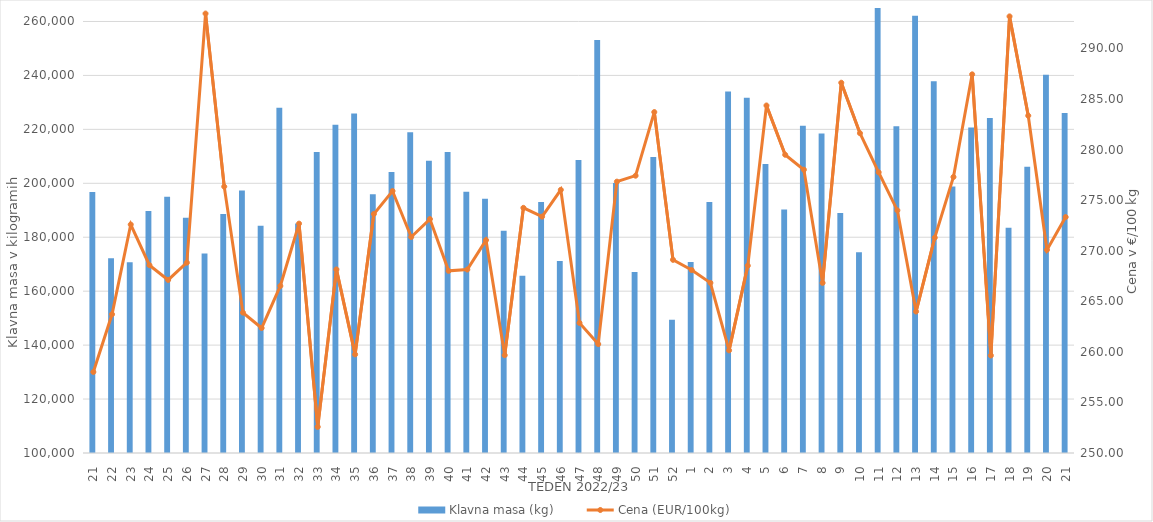
| Category | Klavna masa (kg) |
|---|---|
| 21.0 | 196732 |
| 22.0 | 172190 |
| 23.0 | 170751 |
| 24.0 | 189775 |
| 25.0 | 195029 |
| 26.0 | 187239 |
| 27.0 | 173967 |
| 28.0 | 188601 |
| 29.0 | 197293 |
| 30.0 | 184259 |
| 31.0 | 228023 |
| 32.0 | 185079 |
| 33.0 | 211612 |
| 34.0 | 221748 |
| 35.0 | 225927 |
| 36.0 | 195924 |
| 37.0 | 204224 |
| 38.0 | 218966 |
| 39.0 | 208403 |
| 40.0 | 211635 |
| 41.0 | 196841 |
| 42.0 | 194271 |
| 43.0 | 182399 |
| 44.0 | 165696 |
| 45.0 | 193022 |
| 46.0 | 171172 |
| 47.0 | 208597 |
| 48.0 | 253151 |
| 49.0 | 200117 |
| 50.0 | 167119 |
| 51.0 | 209797 |
| 52.0 | 149439 |
| 1.0 | 170843 |
| 2.0 | 193093 |
| 3.0 | 234042 |
| 4.0 | 231737 |
| 5.0 | 207136 |
| 6.0 | 190311 |
| 7.0 | 221366 |
| 8.0 | 218470 |
| 9.0 | 189006 |
| 10.0 | 174425 |
| 11.0 | 265476 |
| 12.0 | 221171 |
| 13.0 | 262102 |
| 14.0 | 237813 |
| 15.0 | 198828 |
| 16.0 | 220686 |
| 17.0 | 224192 |
| 18.0 | 183508 |
| 19.0 | 206133 |
| 20.0 | 240223 |
| 21.0 | 226050 |